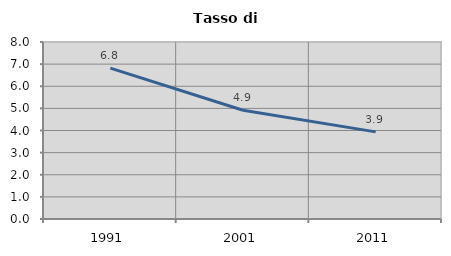
| Category | Tasso di disoccupazione   |
|---|---|
| 1991.0 | 6.821 |
| 2001.0 | 4.916 |
| 2011.0 | 3.937 |